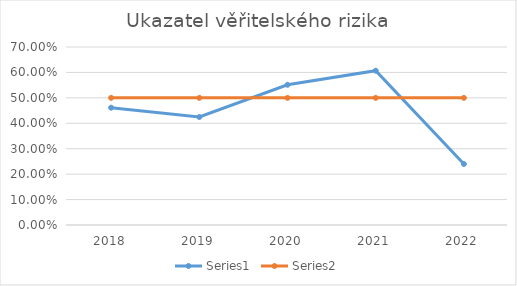
| Category | Series 0 | Series 1 |
|---|---|---|
| 2018.0 | 0.461 | 0.5 |
| 2019.0 | 0.425 | 0.5 |
| 2020.0 | 0.551 | 0.5 |
| 2021.0 | 0.607 | 0.5 |
| 2022.0 | 0.24 | 0.5 |